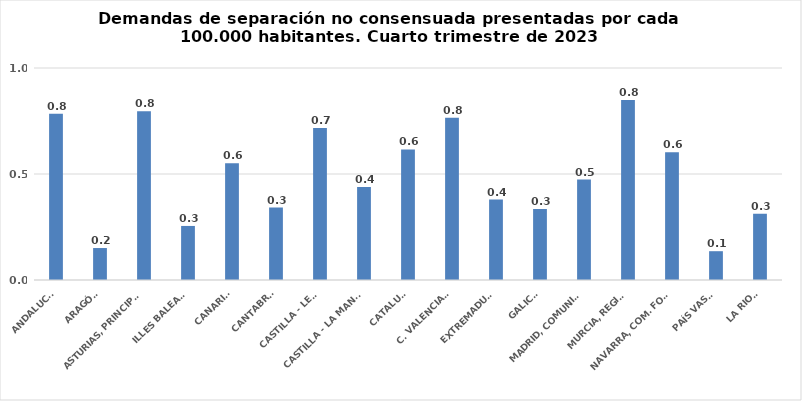
| Category | Series 0 |
|---|---|
| ANDALUCÍA | 0.784 |
| ARAGÓN | 0.151 |
| ASTURIAS, PRINCIPADO | 0.796 |
| ILLES BALEARS | 0.255 |
| CANARIAS | 0.551 |
| CANTABRIA | 0.342 |
| CASTILLA - LEÓN | 0.717 |
| CASTILLA - LA MANCHA | 0.438 |
| CATALUÑA | 0.616 |
| C. VALENCIANA | 0.765 |
| EXTREMADURA | 0.379 |
| GALICIA | 0.335 |
| MADRID, COMUNIDAD | 0.474 |
| MURCIA, REGIÓN | 0.849 |
| NAVARRA, COM. FORAL | 0.602 |
| PAÍS VASCO | 0.136 |
| LA RIOJA | 0.313 |